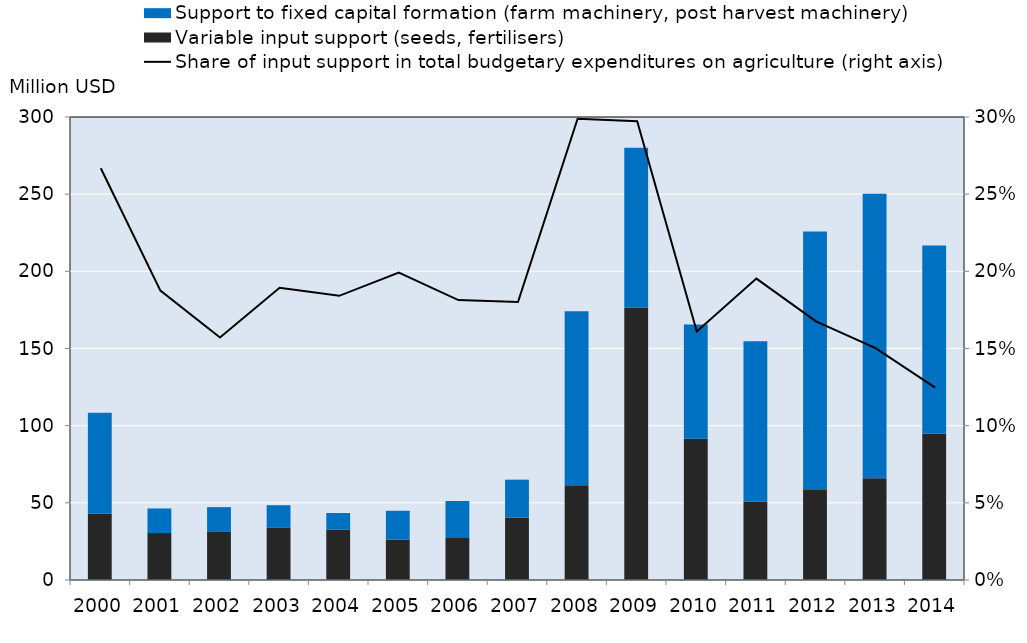
| Category | Variable input support (seeds, fertilisers) | Support to fixed capital formation (farm machinery, post harvest machinery) |
|---|---|---|
| 2000.0 | 43.113 | 65.206 |
| 2001.0 | 30.377 | 15.978 |
| 2002.0 | 31.15 | 16.071 |
| 2003.0 | 33.814 | 14.633 |
| 2004.0 | 32.725 | 10.689 |
| 2005.0 | 26.083 | 18.763 |
| 2006.0 | 27.167 | 24.024 |
| 2007.0 | 40.554 | 24.448 |
| 2008.0 | 61.383 | 112.748 |
| 2009.0 | 176.606 | 103.475 |
| 2010.0 | 91.589 | 73.897 |
| 2011.0 | 50.945 | 103.751 |
| 2012.0 | 58.295 | 167.534 |
| 2013.0 | 65.926 | 184.308 |
| 2014.0 | 94.942 | 121.751 |